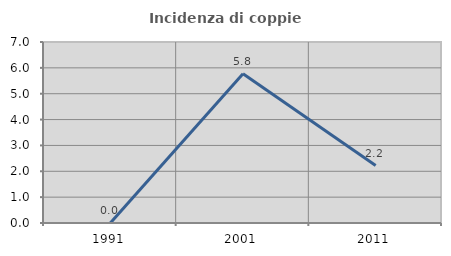
| Category | Incidenza di coppie miste |
|---|---|
| 1991.0 | 0 |
| 2001.0 | 5.769 |
| 2011.0 | 2.222 |